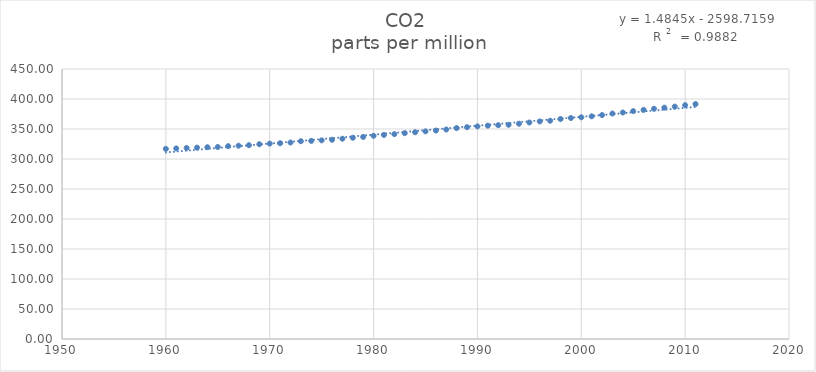
| Category | CO2 
parts per million |
|---|---|
| 1960.0 | 316.91 |
| 1961.0 | 317.64 |
| 1962.0 | 318.45 |
| 1963.0 | 318.99 |
| 1964.0 | 319.62 |
| 1965.0 | 320.04 |
| 1966.0 | 321.38 |
| 1967.0 | 322.16 |
| 1968.0 | 323.04 |
| 1969.0 | 324.62 |
| 1970.0 | 325.68 |
| 1971.0 | 326.32 |
| 1972.0 | 327.45 |
| 1973.0 | 329.68 |
| 1974.0 | 330.18 |
| 1975.0 | 331.08 |
| 1976.0 | 332.05 |
| 1977.0 | 333.78 |
| 1978.0 | 335.41 |
| 1979.0 | 336.78 |
| 1980.0 | 338.68 |
| 1981.0 | 340.1 |
| 1982.0 | 341.44 |
| 1983.0 | 343.03 |
| 1984.0 | 344.58 |
| 1985.0 | 346.04 |
| 1986.0 | 347.39 |
| 1987.0 | 349.16 |
| 1988.0 | 351.56 |
| 1989.0 | 353.07 |
| 1990.0 | 354.35 |
| 1991.0 | 355.57 |
| 1992.0 | 356.38 |
| 1993.0 | 357.07 |
| 1994.0 | 358.82 |
| 1995.0 | 360.8 |
| 1996.0 | 362.59 |
| 1997.0 | 363.71 |
| 1998.0 | 366.65 |
| 1999.0 | 368.33 |
| 2000.0 | 369.52 |
| 2001.0 | 371.13 |
| 2002.0 | 373.22 |
| 2003.0 | 375.77 |
| 2004.0 | 377.49 |
| 2005.0 | 379.8 |
| 2006.0 | 381.9 |
| 2007.0 | 383.77 |
| 2008.0 | 385.59 |
| 2009.0 | 387.38 |
| 2010.0 | 389.78 |
| 2011.0 | 391.57 |